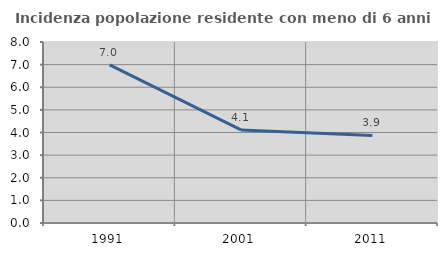
| Category | Incidenza popolazione residente con meno di 6 anni |
|---|---|
| 1991.0 | 6.993 |
| 2001.0 | 4.115 |
| 2011.0 | 3.869 |